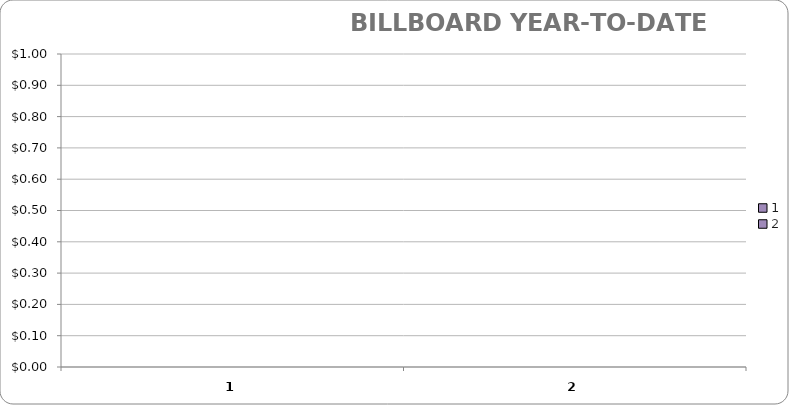
| Category | ALLUVIT MEDIA |
|---|---|
| 0 | 0 |
| 1 | 0 |